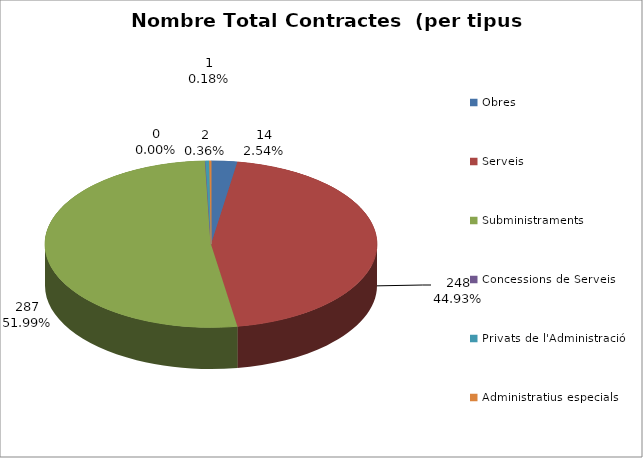
| Category | Nombre Total Contractes |
|---|---|
| Obres | 14 |
| Serveis | 248 |
| Subministraments | 287 |
| Concessions de Serveis | 0 |
| Privats de l'Administració | 2 |
| Administratius especials | 1 |